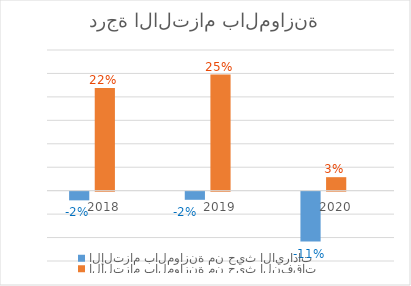
| Category | الإلتزام بالموازنة من حيث الايرادات | الإلتزام بالموازنة من حيث النفقات | المستهدف |
|---|---|---|---|
| 2018.0 | -0.019 | 0.219 | 0 |
| 2019.0 | -0.017 | 0.248 | 0 |
| 2020.0 | -0.107 | 0.029 | 0 |